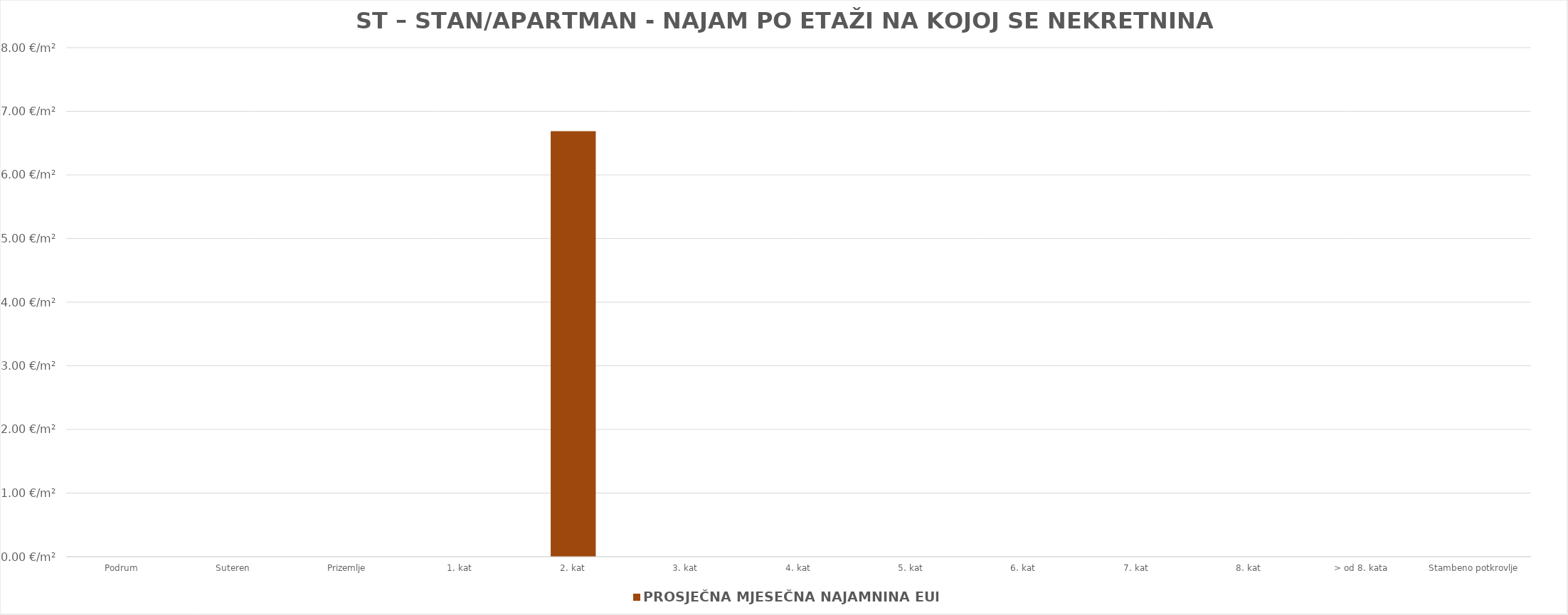
| Category | PROSJEČNA MJESEČNA NAJAMNINA EUR/m² |
|---|---|
| Podrum | 0 |
| Suteren  | 0 |
| Prizemlje | 0 |
| 1. kat | 0 |
| 2. kat | 1900-01-06 16:27:31 |
| 3. kat | 0 |
| 4. kat | 0 |
| 5. kat | 0 |
| 6. kat | 0 |
| 7. kat | 0 |
| 8. kat | 0 |
| > od 8. kata | 0 |
| Stambeno potkrovlje | 0 |